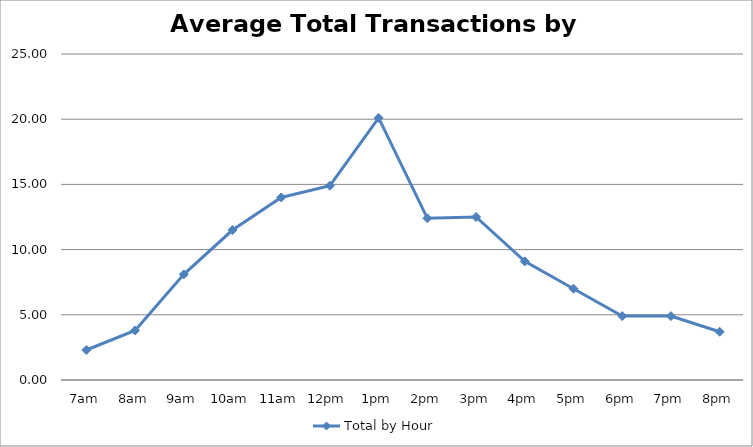
| Category | Total by Hour |
|---|---|
| 7am | 2.3 |
| 8am | 3.8 |
| 9am | 8.1 |
| 10am | 11.5 |
| 11am | 14 |
| 12pm | 14.9 |
| 1pm | 20.1 |
| 2pm | 12.4 |
| 3pm | 12.5 |
| 4pm | 9.1 |
| 5pm | 7 |
| 6pm | 4.9 |
| 7pm | 4.9 |
| 8pm | 3.7 |